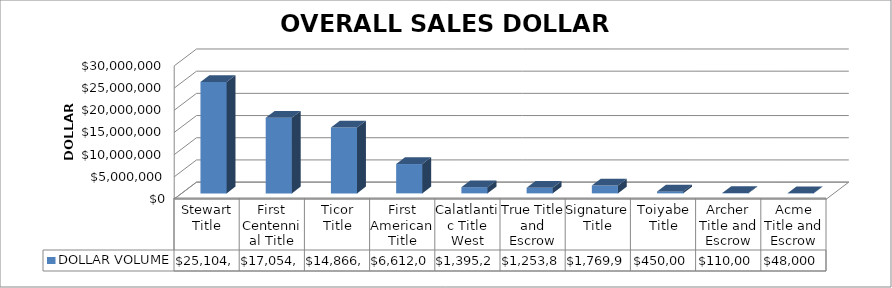
| Category | DOLLAR VOLUME |
|---|---|
| Stewart Title | 25104289 |
| First Centennial Title | 17054588 |
| Ticor Title | 14866276.31 |
| First American Title | 6612000 |
| Calatlantic Title West | 1395207 |
| True Title and Escrow | 1253800 |
| Signature Title | 1769900 |
| Toiyabe Title | 450000 |
| Archer Title and Escrow | 110000 |
| Acme Title and Escrow | 48000 |